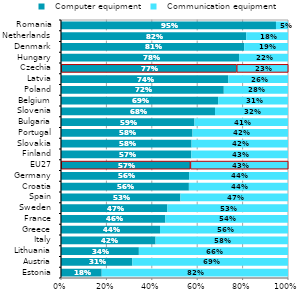
| Category |   Computer equipment |   Communication equipment |
|---|---|---|
| Estonia | 0.179 | 0.821 |
| Austria | 0.314 | 0.686 |
| Lithuania | 0.343 | 0.657 |
| Italy | 0.417 | 0.583 |
| Greece | 0.436 | 0.564 |
| France | 0.459 | 0.541 |
| Sweden | 0.469 | 0.531 |
| Spain | 0.526 | 0.474 |
| Croatia | 0.563 | 0.437 |
| Germany | 0.564 | 0.436 |
| EU27 | 0.569 | 0.431 |
| Finland | 0.574 | 0.426 |
| Slovakia | 0.575 | 0.425 |
| Portugal | 0.579 | 0.421 |
| Bulgaria | 0.588 | 0.412 |
| Slovenia | 0.678 | 0.322 |
| Belgium | 0.692 | 0.308 |
| Poland | 0.717 | 0.283 |
| Latvia | 0.737 | 0.263 |
| Czechia | 0.773 | 0.227 |
| Hungary | 0.785 | 0.215 |
| Denmark | 0.807 | 0.193 |
| Netherlands | 0.816 | 0.184 |
| Romania | 0.947 | 0.053 |